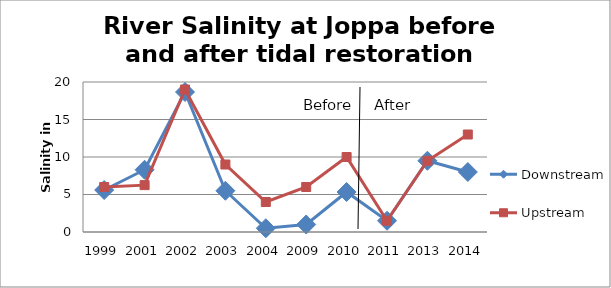
| Category | Downstream | Upstream |
|---|---|---|
| 1999.0 | 5.6 | 6 |
| 2001.0 | 8.3 | 6.25 |
| 2002.0 | 18.667 | 19 |
| 2003.0 | 5.5 | 9 |
| 2004.0 | 0.5 | 4 |
| 2009.0 | 1 | 6 |
| 2010.0 | 5.333 | 10 |
| 2011.0 | 1.5 | 1.5 |
| 2013.0 | 9.5 | 9.5 |
| 2014.0 | 8 | 13 |